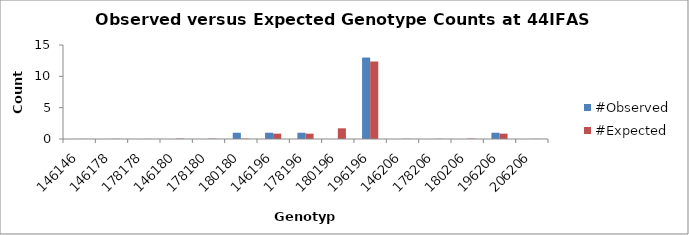
| Category | #Observed | #Expected |
|---|---|---|
| 146146.0 | 0 | 0.015 |
| 146178.0 | 0 | 0.029 |
| 178178.0 | 0 | 0.015 |
| 146180.0 | 0 | 0.059 |
| 178180.0 | 0 | 0.059 |
| 180180.0 | 1 | 0.059 |
| 146196.0 | 1 | 0.853 |
| 178196.0 | 1 | 0.853 |
| 180196.0 | 0 | 1.706 |
| 196196.0 | 13 | 12.368 |
| 146206.0 | 0 | 0.029 |
| 178206.0 | 0 | 0.029 |
| 180206.0 | 0 | 0.059 |
| 196206.0 | 1 | 0.853 |
| 206206.0 | 0 | 0.015 |